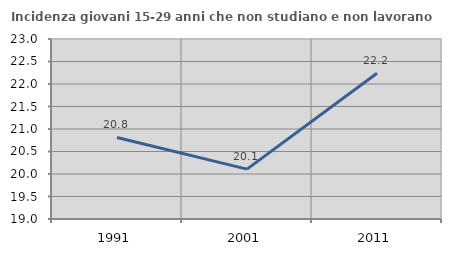
| Category | Incidenza giovani 15-29 anni che non studiano e non lavorano  |
|---|---|
| 1991.0 | 20.812 |
| 2001.0 | 20.109 |
| 2011.0 | 22.239 |